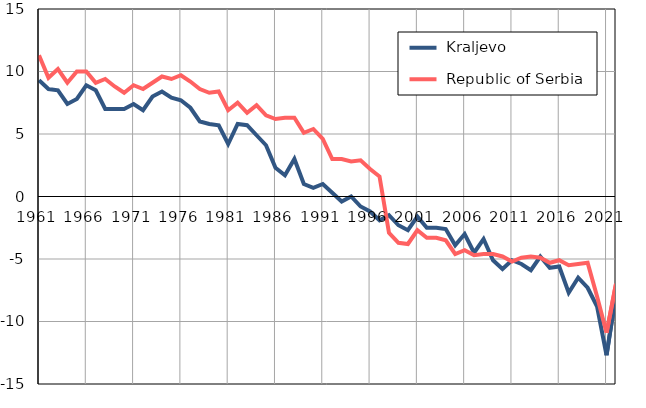
| Category |  Kraljevo |  Republic of Serbia |
|---|---|---|
| 1961.0 | 9.3 | 11.3 |
| 1962.0 | 8.6 | 9.5 |
| 1963.0 | 8.5 | 10.2 |
| 1964.0 | 7.4 | 9.1 |
| 1965.0 | 7.8 | 10 |
| 1966.0 | 8.9 | 10 |
| 1967.0 | 8.5 | 9.1 |
| 1968.0 | 7 | 9.4 |
| 1969.0 | 7 | 8.8 |
| 1970.0 | 7 | 8.3 |
| 1971.0 | 7.4 | 8.9 |
| 1972.0 | 6.9 | 8.6 |
| 1973.0 | 8 | 9.1 |
| 1974.0 | 8.4 | 9.6 |
| 1975.0 | 7.9 | 9.4 |
| 1976.0 | 7.7 | 9.7 |
| 1977.0 | 7.1 | 9.2 |
| 1978.0 | 6 | 8.6 |
| 1979.0 | 5.8 | 8.3 |
| 1980.0 | 5.7 | 8.4 |
| 1981.0 | 4.2 | 6.9 |
| 1982.0 | 5.8 | 7.5 |
| 1983.0 | 5.7 | 6.7 |
| 1984.0 | 4.9 | 7.3 |
| 1985.0 | 4.1 | 6.5 |
| 1986.0 | 2.3 | 6.2 |
| 1987.0 | 1.7 | 6.3 |
| 1988.0 | 3 | 6.3 |
| 1989.0 | 1 | 5.1 |
| 1990.0 | 0.7 | 5.4 |
| 1991.0 | 1 | 4.6 |
| 1992.0 | 0.3 | 3 |
| 1993.0 | -0.4 | 3 |
| 1994.0 | 0 | 2.8 |
| 1995.0 | -0.8 | 2.9 |
| 1996.0 | -1.2 | 2.2 |
| 1997.0 | -1.9 | 1.6 |
| 1998.0 | -1.5 | -2.9 |
| 1999.0 | -2.3 | -3.7 |
| 2000.0 | -2.7 | -3.8 |
| 2001.0 | -1.6 | -2.7 |
| 2002.0 | -2.5 | -3.3 |
| 2003.0 | -2.5 | -3.3 |
| 2004.0 | -2.6 | -3.5 |
| 2005.0 | -3.9 | -4.6 |
| 2006.0 | -3 | -4.3 |
| 2007.0 | -4.5 | -4.7 |
| 2008.0 | -3.4 | -4.6 |
| 2009.0 | -5.1 | -4.6 |
| 2010.0 | -5.8 | -4.8 |
| 2011.0 | -5.1 | -5.2 |
| 2012.0 | -5.4 | -4.9 |
| 2013.0 | -5.9 | -4.8 |
| 2014.0 | -4.8 | -4.9 |
| 2015.0 | -5.7 | -5.3 |
| 2016.0 | -5.6 | -5.1 |
| 2017.0 | -7.7 | -5.5 |
| 2018.0 | -6.5 | -5.4 |
| 2019.0 | -7.3 | -5.3 |
| 2020.0 | -8.8 | -8 |
| 2021.0 | -12.7 | -10.9 |
| 2022.0 | -7.8 | -7 |